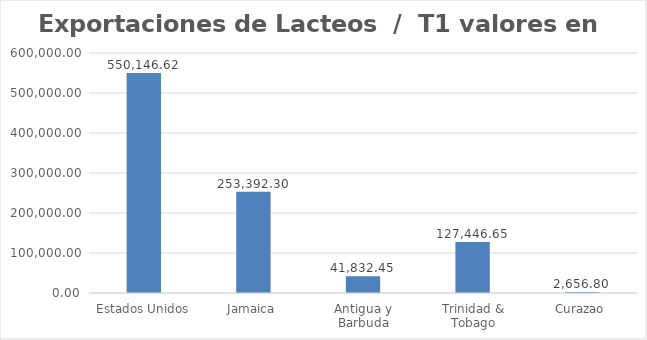
| Category | Valor US  |
|---|---|
| Estados Unidos | 550146.624 |
| Jamaica | 253392.301 |
| Antigua y Barbuda | 41832.449 |
| Trinidad & Tobago | 127446.648 |
| Curazao | 2656.8 |